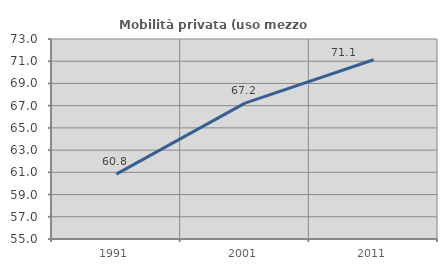
| Category | Mobilità privata (uso mezzo privato) |
|---|---|
| 1991.0 | 60.835 |
| 2001.0 | 67.225 |
| 2011.0 | 71.134 |